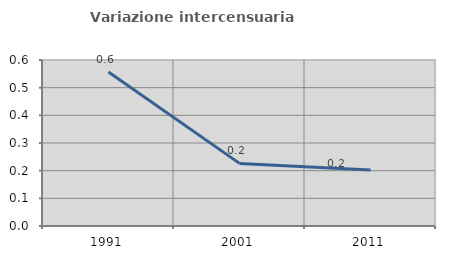
| Category | Variazione intercensuaria annua |
|---|---|
| 1991.0 | 0.557 |
| 2001.0 | 0.226 |
| 2011.0 | 0.202 |